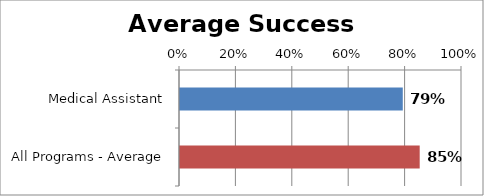
| Category | RetentionRate |
|---|---|
| Medical Assistant | 0.79 |
| All Programs - Average | 0.85 |